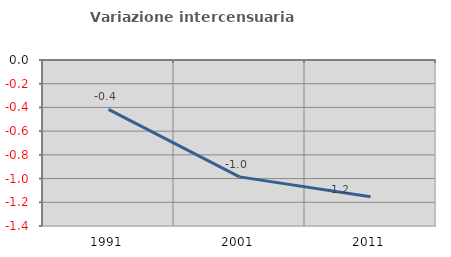
| Category | Variazione intercensuaria annua |
|---|---|
| 1991.0 | -0.417 |
| 2001.0 | -0.986 |
| 2011.0 | -1.154 |